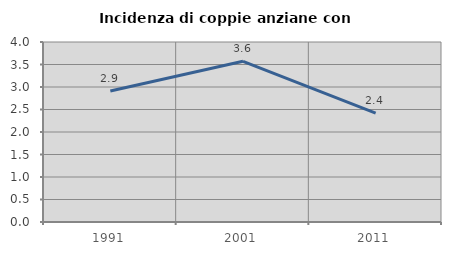
| Category | Incidenza di coppie anziane con figli |
|---|---|
| 1991.0 | 2.913 |
| 2001.0 | 3.571 |
| 2011.0 | 2.419 |